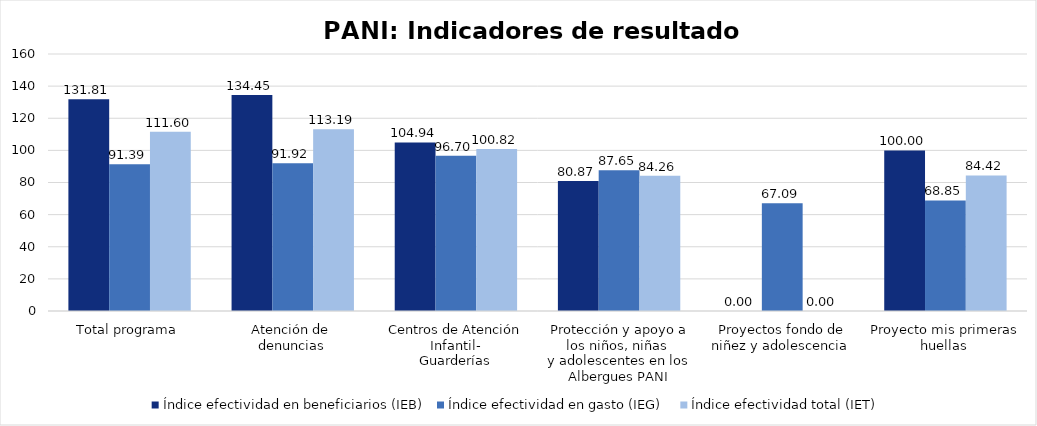
| Category | Índice efectividad en beneficiarios (IEB) | Índice efectividad en gasto (IEG)  | Índice efectividad total (IET) |
|---|---|---|---|
| Total programa | 131.806 | 91.387 | 111.597 |
| Atención de 
denuncias | 134.45 | 91.921 | 113.185 |
| Centros de Atención Infantil-
Guarderías | 104.94 | 96.702 | 100.821 |
| Protección y apoyo a los niños, niñas 
y adolescentes en los Albergues PANI | 80.87 | 87.651 | 84.26 |
| Proyectos fondo de niñez y adolescencia  | 0 | 67.087 | 0 |
| Proyecto mis primeras huellas  | 100 | 68.847 | 84.423 |